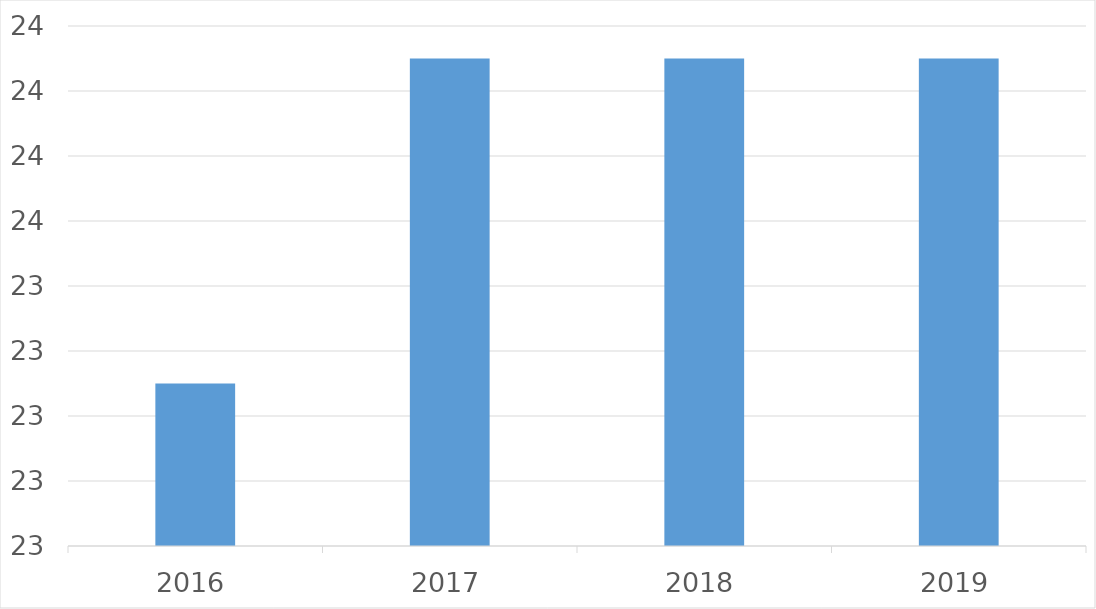
| Category | Series 0 |
|---|---|
| 2016 | 23 |
| 2017 | 24 |
| 2018 | 24 |
| 2019 | 24 |